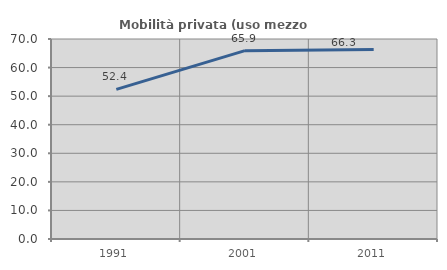
| Category | Mobilità privata (uso mezzo privato) |
|---|---|
| 1991.0 | 52.356 |
| 2001.0 | 65.928 |
| 2011.0 | 66.306 |